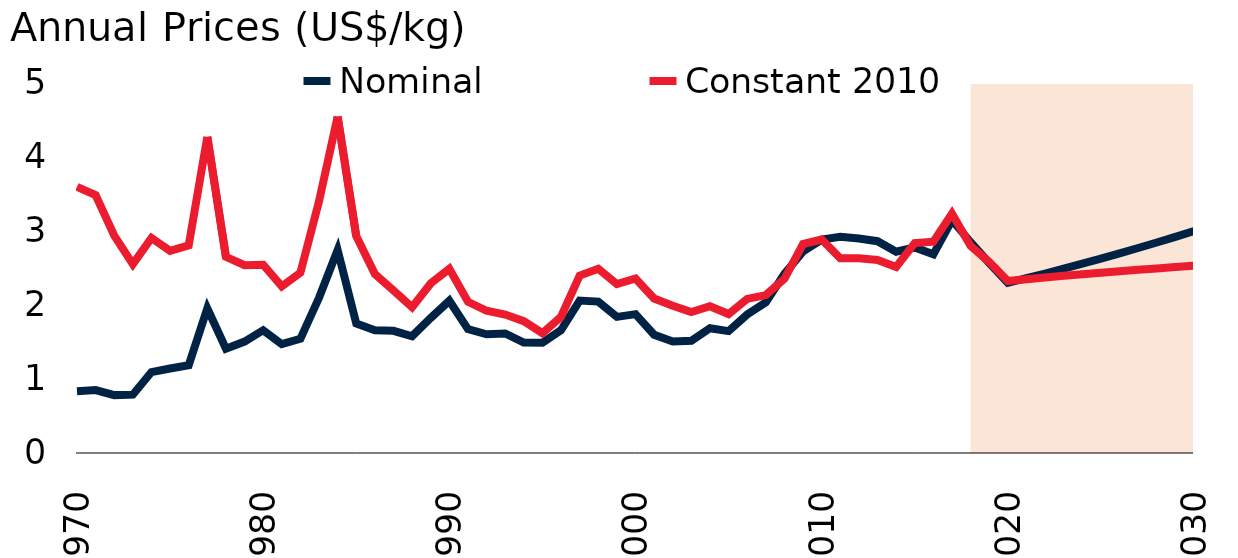
| Category | Nominal | Constant 2010 |
|---|---|---|
| 1970.0 | 0.835 | 3.597 |
| 1971.0 | 0.851 | 3.484 |
| 1972.0 | 0.782 | 2.937 |
| 1973.0 | 0.788 | 2.552 |
| 1974.0 | 1.094 | 2.906 |
| 1975.0 | 1.142 | 2.732 |
| 1976.0 | 1.187 | 2.805 |
| 1977.0 | 1.954 | 4.273 |
| 1978.0 | 1.409 | 2.652 |
| 1979.0 | 1.505 | 2.539 |
| 1980.0 | 1.659 | 2.544 |
| 1981.0 | 1.47 | 2.251 |
| 1982.0 | 1.543 | 2.436 |
| 1983.0 | 2.097 | 3.4 |
| 1984.0 | 2.742 | 4.545 |
| 1985.0 | 1.749 | 2.931 |
| 1986.0 | 1.66 | 2.417 |
| 1987.0 | 1.651 | 2.195 |
| 1988.0 | 1.578 | 1.97 |
| 1989.0 | 1.825 | 2.292 |
| 1990.0 | 2.058 | 2.489 |
| 1991.0 | 1.674 | 2.044 |
| 1992.0 | 1.604 | 1.923 |
| 1993.0 | 1.615 | 1.871 |
| 1994.0 | 1.492 | 1.782 |
| 1995.0 | 1.489 | 1.619 |
| 1996.0 | 1.661 | 1.842 |
| 1997.0 | 2.06 | 2.398 |
| 1998.0 | 2.046 | 2.49 |
| 1999.0 | 1.839 | 2.282 |
| 2000.0 | 1.876 | 2.358 |
| 2001.0 | 1.598 | 2.087 |
| 2002.0 | 1.506 | 1.99 |
| 2003.0 | 1.517 | 1.905 |
| 2004.0 | 1.686 | 1.982 |
| 2005.0 | 1.647 | 1.878 |
| 2006.0 | 1.872 | 2.082 |
| 2007.0 | 2.036 | 2.134 |
| 2008.0 | 2.42 | 2.354 |
| 2009.0 | 2.724 | 2.824 |
| 2010.0 | 2.885 | 2.885 |
| 2011.0 | 2.921 | 2.631 |
| 2012.0 | 2.898 | 2.63 |
| 2013.0 | 2.862 | 2.609 |
| 2014.0 | 2.72 | 2.514 |
| 2015.0 | 2.777 | 2.838 |
| 2016.0 | 2.685 | 2.855 |
| 2017.0 | 3.148 | 3.235 |
| 2018.0 | 2.848 | 2.798 |
| 2019.0 | 2.567 | 2.581 |
| 2020.0 | 2.3 | 2.323 |
| 2021.0 | 2.362 | 2.349 |
| 2022.0 | 2.426 | 2.372 |
| 2023.0 | 2.491 | 2.394 |
| 2024.0 | 2.558 | 2.416 |
| 2025.0 | 2.627 | 2.436 |
| 2026.0 | 2.698 | 2.456 |
| 2027.0 | 2.77 | 2.476 |
| 2028.0 | 2.845 | 2.494 |
| 2029.0 | 2.921 | 2.513 |
| 2030.0 | 3 | 2.53 |